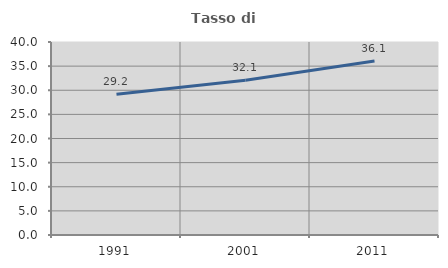
| Category | Tasso di occupazione   |
|---|---|
| 1991.0 | 29.168 |
| 2001.0 | 32.075 |
| 2011.0 | 36.056 |